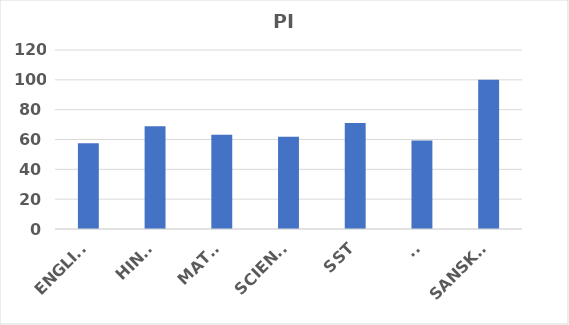
| Category | PI |
|---|---|
| ENGLISH | 57.5 |
| HINDI | 68.92 |
| MATHS | 63.21 |
| SCIENCE | 61.78 |
| SST | 71.07 |
| AI | 59.28 |
| SANSKRIT | 100 |